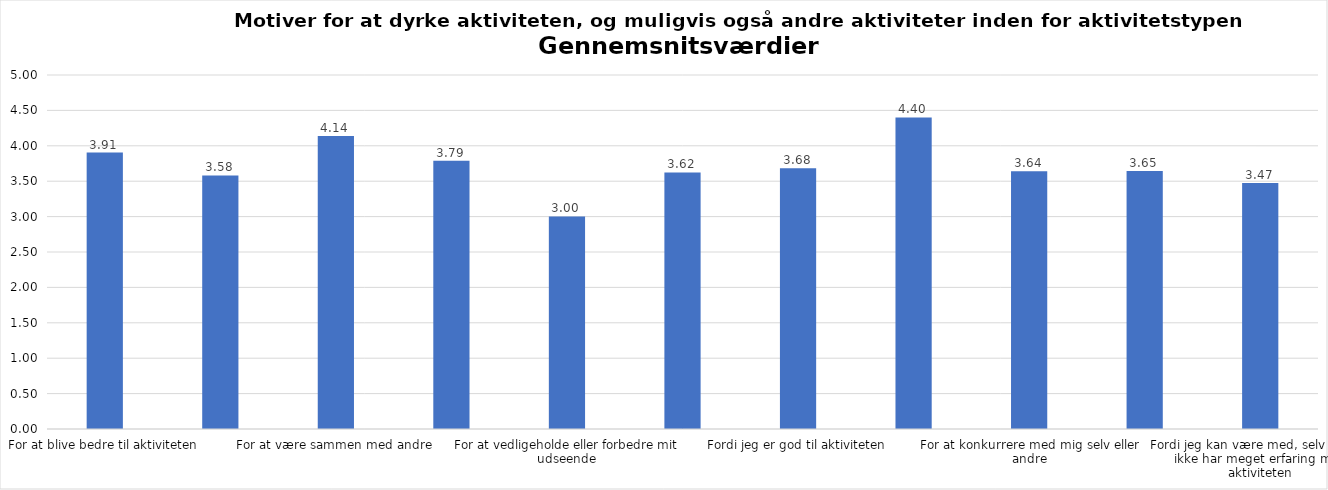
| Category | Gennemsnit |
|---|---|
| For at blive bedre til aktiviteten | 3.905 |
| For at vedligeholde eller forbedre min sundhed (fx helbred, fysisk form) | 3.581 |
| For at være sammen med andre | 4.138 |
| For at gøre noget godt for mig selv | 3.789 |
| For at vedligeholde eller forbedre mit udseende | 3.003 |
| Fordi andre i min omgangskreds opmuntrer mig til det | 3.624 |
| Fordi jeg er god til aktiviteten | 3.682 |
| Fordi jeg godt kan lide aktiviteten | 4.401 |
| For at konkurrere med mig selv eller andre | 3.639 |
| Fordi aktiviteten passer godt ind i min hverdag | 3.645 |
| Fordi jeg kan være med, selv om jeg ikke har meget erfaring med aktiviteten | 3.474 |